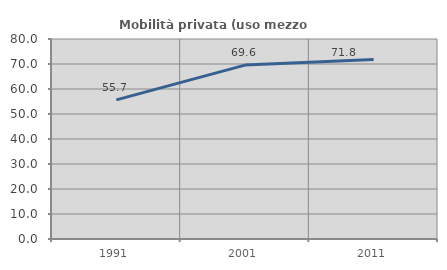
| Category | Mobilità privata (uso mezzo privato) |
|---|---|
| 1991.0 | 55.658 |
| 2001.0 | 69.553 |
| 2011.0 | 71.849 |